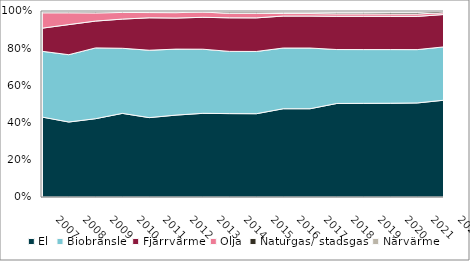
| Category | El | Biobränsle | Fjärrvärme | Olja | Naturgas/ stadsgas | Närvärme |
|---|---|---|---|---|---|---|
| 2007 | 0.43 | 0.354 | 0.124 | 0.083 | 0.006 | 0.003 |
| 2008 | 0.403 | 0.362 | 0.162 | 0.063 | 0.006 | 0.003 |
| 2009 | 0.421 | 0.381 | 0.144 | 0.044 | 0.006 | 0.004 |
| 2010 | 0.45 | 0.35 | 0.157 | 0.036 | 0.006 | 0.002 |
| 2011 | 0.427 | 0.362 | 0.174 | 0.028 | 0.004 | 0.005 |
| 2012 | 0.44 | 0.355 | 0.167 | 0.029 | 0.005 | 0.004 |
| 2013 | 0.45 | 0.345 | 0.172 | 0.028 | 0.003 | 0.003 |
| 2014 | 0.448 | 0.335 | 0.18 | 0.024 | 0.008 | 0.005 |
| 2015 | 0.448 | 0.335 | 0.181 | 0.024 | 0.008 | 0.005 |
| 2016 | 0.475 | 0.326 | 0.172 | 0.013 | 0.008 | 0.006 |
| 2017 | 0.475 | 0.326 | 0.172 | 0.013 | 0.008 | 0.006 |
| 2018 | 0.503 | 0.29 | 0.179 | 0.013 | 0.009 | 0.007 |
| 2019 | 0.503 | 0.289 | 0.179 | 0.013 | 0.009 | 0.007 |
| 2020 | 0.504 | 0.289 | 0.179 | 0.013 | 0.009 | 0.007 |
| 2021 | 0.506 | 0.287 | 0.179 | 0.013 | 0.009 | 0.007 |
| 2022 | 0.52 | 0.287 | 0.174 | 0.01 | 0.008 | 0.002 |